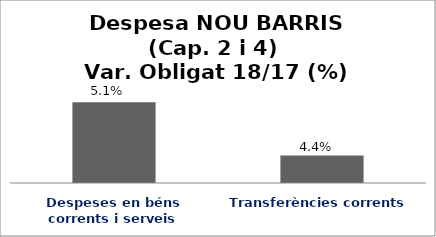
| Category | Series 0 |
|---|---|
| Despeses en béns corrents i serveis | 0.051 |
| Transferències corrents | 0.044 |